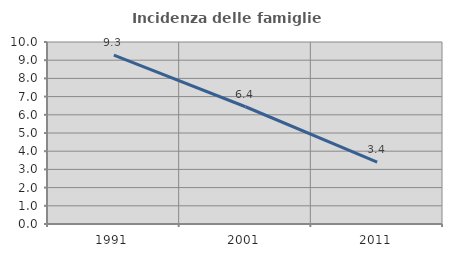
| Category | Incidenza delle famiglie numerose |
|---|---|
| 1991.0 | 9.28 |
| 2001.0 | 6.443 |
| 2011.0 | 3.405 |